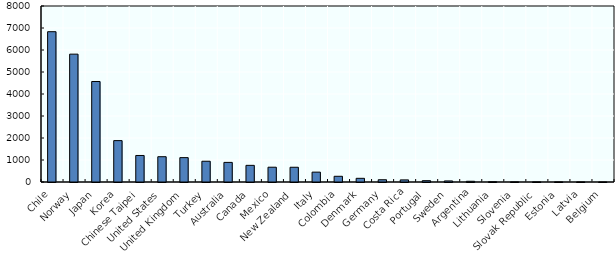
| Category | Aquaculture value of production |
|---|---|
| Chile | 6832.03 |
| Norway | 5811.289 |
| Japan | 4568.773 |
| Korea | 1881.371 |
| Chinese Taipei | 1205.376 |
| United States | 1149.613 |
| United Kingdom | 1107.931 |
| Turkey | 943.533 |
| Australia | 891.265 |
| Canada | 756.834 |
| Mexico | 672.459 |
| New Zealand | 670.114 |
| Italy | 448.675 |
| Colombia | 259.308 |
| Denmark | 167.314 |
| Germany | 102.741 |
| Costa Rica | 95.835 |
| Portugal | 60.144 |
| Sweden | 48.616 |
| Argentina | 33.346 |
| Lithuania | 11.965 |
| Slovenia | 4.077 |
| Slovak Republic | 3.926 |
| Estonia | 3.916 |
| Latvia | 2.651 |
| Belgium | 0.369 |